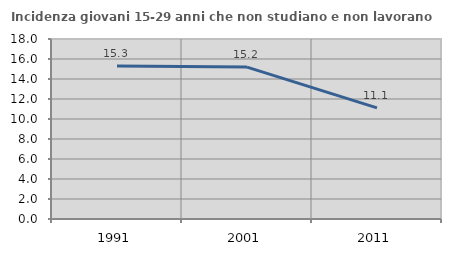
| Category | Incidenza giovani 15-29 anni che non studiano e non lavorano  |
|---|---|
| 1991.0 | 15.296 |
| 2001.0 | 15.19 |
| 2011.0 | 11.111 |